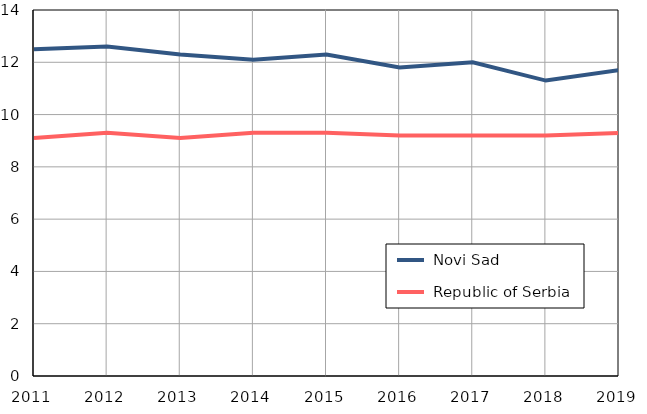
| Category |  Novi Sad |  Republic of Serbia |
|---|---|---|
| 2011.0 | 12.5 | 9.1 |
| 2012.0 | 12.6 | 9.3 |
| 2013.0 | 12.3 | 9.1 |
| 2014.0 | 12.1 | 9.3 |
| 2015.0 | 12.3 | 9.3 |
| 2016.0 | 11.8 | 9.2 |
| 2017.0 | 12 | 9.2 |
| 2018.0 | 11.3 | 9.2 |
| 2019.0 | 11.7 | 9.3 |